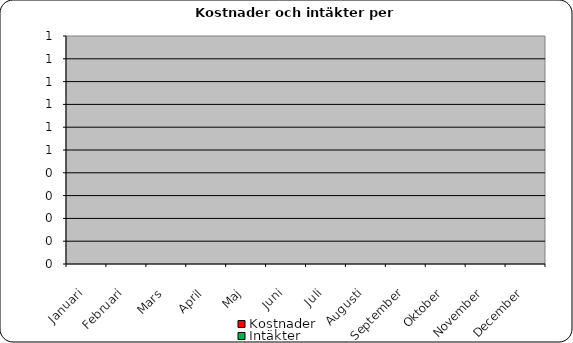
| Category | Kostnader | Intäkter |
|---|---|---|
| Januari | 0 | 0 |
| Februari | 0 | 0 |
| Mars | 0 | 0 |
| April | 0 | 0 |
| Maj | 0 | 0 |
| Juni | 0 | 0 |
| Juli | 0 | 0 |
| Augusti | 0 | 0 |
| September | 0 | 0 |
| Oktober | 0 | 0 |
| November | 0 | 0 |
| December | 0 | 0 |